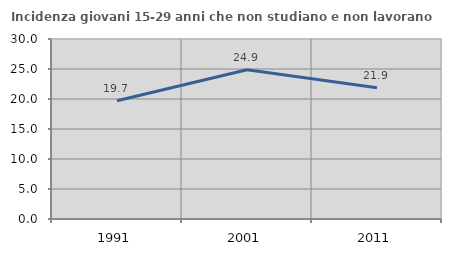
| Category | Incidenza giovani 15-29 anni che non studiano e non lavorano  |
|---|---|
| 1991.0 | 19.699 |
| 2001.0 | 24.88 |
| 2011.0 | 21.877 |